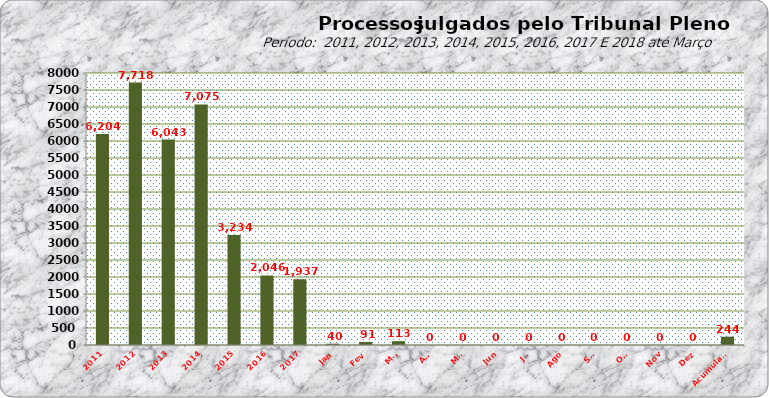
| Category | Series 0 |
|---|---|
| 2011 | 6204 |
| 2012 | 7718 |
| 2013 | 6043 |
| 2014 | 7075 |
| 2015 | 3234 |
| 2016 | 2046 |
| 2017 | 1937 |
| Jan | 40 |
| Fev | 91 |
| Mar | 113 |
| Abr | 0 |
| Mai | 0 |
| Jun | 0 |
| Jul | 0 |
| Ago | 0 |
| Set | 0 |
| Out | 0 |
| Nov | 0 |
| Dez | 0 |
| Acumulado | 244 |